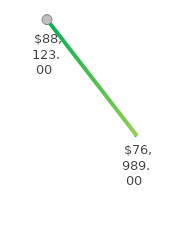
| Category | Series 0 |
|---|---|
| 0 | 88123 |
| 1 | 76989 |